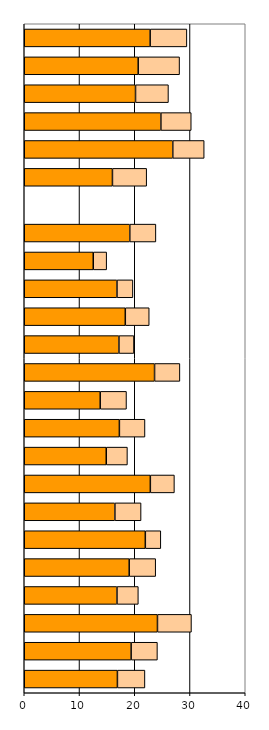
| Category | Series 0 | Series 1 |
|---|---|---|
| 0 | 16.864 | 4.98 |
| 1 | 19.345 | 4.759 |
| 2 | 24.111 | 6.153 |
| 3 | 16.784 | 3.864 |
| 4 | 18.994 | 4.797 |
| 5 | 21.913 | 2.805 |
| 6 | 16.405 | 4.739 |
| 7 | 22.821 | 4.356 |
| 8 | 14.843 | 3.83 |
| 9 | 17.22 | 4.631 |
| 10 | 13.748 | 4.756 |
| 11 | 23.583 | 4.588 |
| 12 | 17.138 | 2.72 |
| 13 | 18.289 | 4.327 |
| 14 | 16.784 | 2.882 |
| 15 | 12.492 | 2.426 |
| 16 | 19.103 | 4.725 |
| 17 | 0 | 0 |
| 18 | 15.964 | 6.195 |
| 19 | 26.883 | 5.684 |
| 20 | 24.729 | 5.495 |
| 21 | 20.139 | 5.96 |
| 22 | 20.624 | 7.49 |
| 23 | 22.79 | 6.645 |